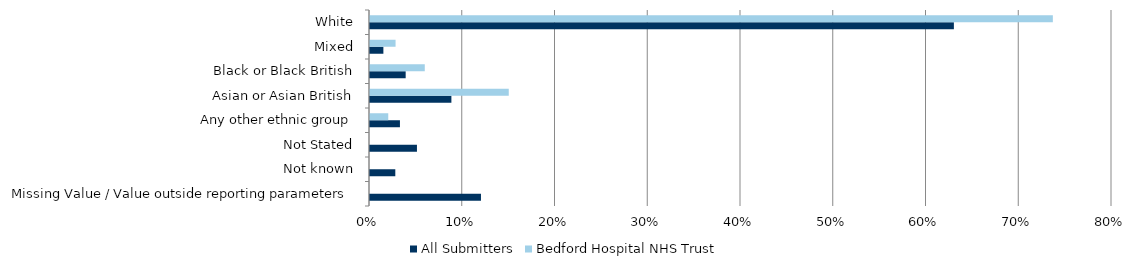
| Category | All Submitters | Bedford Hospital NHS Trust |
|---|---|---|
| Missing Value / Value outside reporting parameters | 0.12 | 0 |
| Not known | 0.027 | 0 |
| Not Stated | 0.051 | 0 |
| Any other ethnic group | 0.032 | 0.02 |
| Asian or Asian British | 0.088 | 0.15 |
| Black or Black British | 0.038 | 0.059 |
| Mixed | 0.014 | 0.028 |
| White | 0.63 | 0.736 |